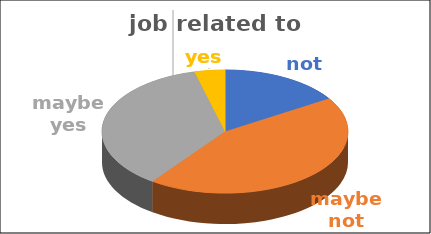
| Category | job related to studies | Series 1 | Series 2 | Series 3 | Series 4 |
|---|---|---|---|---|---|
| not | 0.16 |  |  |  |  |
| maybe not | 0.44 |  |  |  |  |
| maybe yes | 0.36 |  |  |  |  |
| yes | 0.04 |  |  |  |  |